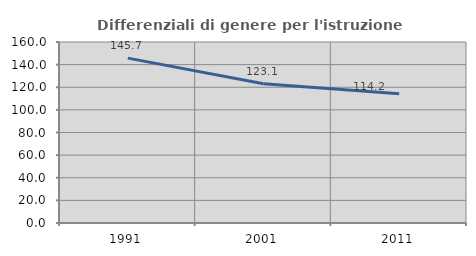
| Category | Differenziali di genere per l'istruzione superiore |
|---|---|
| 1991.0 | 145.75 |
| 2001.0 | 123.077 |
| 2011.0 | 114.186 |